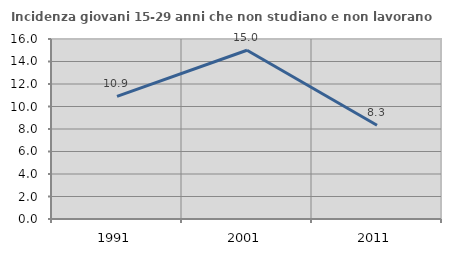
| Category | Incidenza giovani 15-29 anni che non studiano e non lavorano  |
|---|---|
| 1991.0 | 10.902 |
| 2001.0 | 15 |
| 2011.0 | 8.333 |